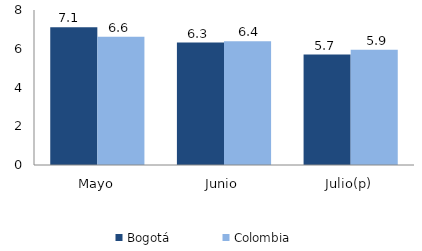
| Category | Bogotá | Colombia |
|---|---|---|
| Mayo | 7.109 | 6.625 |
| Junio | 6.322 | 6.382 |
| Julio(p) | 5.699 | 5.948 |